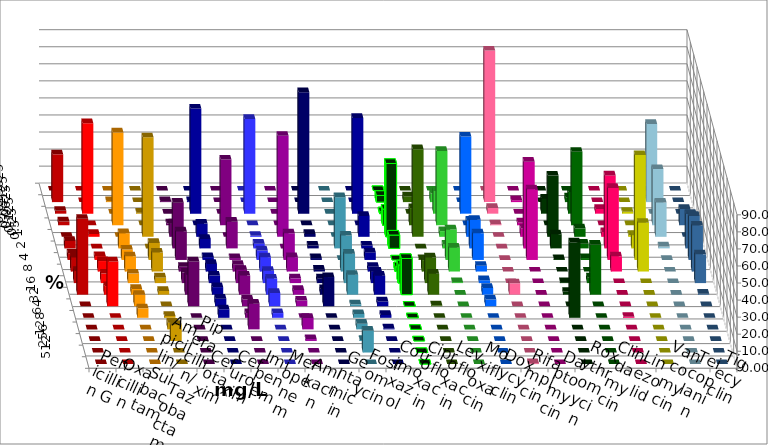
| Category | Penicillin G | Oxacillin | Ampicillin/ Sulbactam | Piperacillin/ Tazobactam | Cefotaxim | Cefuroxim | Imipenem | Meropenem | Amikacin | Gentamicin | Fosfomycin | Cotrimoxazol | Ciprofloxacin | Levofloxacin | Moxifloxacin | Doxycyclin | Rifampicin | Daptomycin | Roxythromycin | Clindamycin | Linezolid | Vancomycin | Teicoplanin | Tigecyclin |
|---|---|---|---|---|---|---|---|---|---|---|---|---|---|---|---|---|---|---|---|---|---|---|---|---|
| 0.015625 | 0 | 0 | 0 | 0 | 0 | 0 | 0 | 0 | 0 | 0 | 0 | 0 | 0 | 0 | 0 | 0 | 0 | 0 | 0 | 0 | 0 | 0 | 0 | 0 |
| 0.03125 | 28.022 | 0 | 0.556 | 0 | 0.559 | 0 | 0.556 | 0 | 0 | 0 | 0 | 0 | 3.911 | 3.352 | 5.028 | 0 | 88.889 | 1.105 | 0 | 2.762 | 0 | 0 | 0 | 45.81 |
| 0.0625 | 1.648 | 53.073 | 0 | 0.556 | 0 | 0 | 61.667 | 55.556 | 0 | 71.271 | 0 | 56.111 | 1.117 | 0 | 13.408 | 45.251 | 3.333 | 0 | 8.84 | 12.707 | 2.778 | 1.099 | 0 | 0 |
| 0.125 | 2.198 | 0 | 54.444 | 0 | 1.117 | 38.547 | 0 | 0 | 0 | 0 | 0 | 0 | 9.497 | 10.056 | 43.575 | 0 | 0.556 | 1.657 | 0 | 43.094 | 0 | 0 | 9.551 | 32.961 |
| 0.25 | 0 | 1.676 | 0 | 58.333 | 7.821 | 0 | 7.778 | 0.556 | 59.218 | 1.657 | 0 | 12.222 | 43.017 | 51.397 | 3.352 | 9.497 | 0 | 4.972 | 35.912 | 4.972 | 2.778 | 1.099 | 0 | 20.112 |
| 0.5 | 4.396 | 0 | 8.889 | 0 | 26.816 | 15.642 | 5.556 | 2.778 | 0 | 1.657 | 30 | 1.667 | 7.821 | 0 | 2.235 | 16.76 | 0 | 50.829 | 8.287 | 2.762 | 42.778 | 7.692 | 20.225 | 1.117 |
| 1.0 | 3.846 | 2.235 | 6.111 | 10 | 16.76 | 1.117 | 1.667 | 5.556 | 15.642 | 1.105 | 0 | 4.444 | 0 | 0.559 | 17.877 | 15.642 | 0 | 41.436 | 0.552 | 1.105 | 42.222 | 61.538 | 25.843 | 0 |
| 2.0 | 8.242 | 6.145 | 8.889 | 11.111 | 2.793 | 3.911 | 4.444 | 8.333 | 8.38 | 1.105 | 21.111 | 2.778 | 2.793 | 6.704 | 13.966 | 3.352 | 0 | 0 | 0 | 0 | 8.889 | 28.571 | 26.966 | 0 |
| 4.0 | 7.143 | 5.587 | 5.556 | 3.333 | 6.145 | 7.821 | 4.444 | 7.222 | 2.793 | 2.762 | 17.222 | 6.667 | 10.615 | 15.084 | 0.559 | 1.676 | 0 | 0 | 0.552 | 3.315 | 0 | 0 | 16.854 | 0 |
| 8.0 | 44.505 | 5.028 | 3.333 | 2.222 | 11.732 | 11.173 | 4.444 | 9.444 | 2.793 | 3.315 | 11.667 | 11.111 | 21.229 | 12.291 | 0 | 3.911 | 6.667 | 0 | 1.657 | 29.282 | 0 | 0 | 0.562 | 0 |
| 16.0 | 0 | 26.257 | 6.667 | 0 | 26.257 | 3.911 | 4.444 | 7.778 | 3.352 | 17.127 | 1.111 | 2.778 | 0 | 0.559 | 0 | 3.911 | 0 | 0 | 0 | 0 | 0 | 0 | 0 | 0 |
| 32.0 | 0 | 0 | 5.556 | 1.111 | 0 | 2.793 | 5 | 2.778 | 0 | 0 | 2.222 | 1.667 | 0 | 0 | 0 | 0 | 0 | 0 | 44.199 | 0 | 0.556 | 0 | 0 | 0 |
| 64.0 | 0 | 0 | 0 | 3.889 | 0 | 15.084 | 0 | 0 | 6.704 | 0 | 3.333 | 0.556 | 0 | 0 | 0 | 0 | 0 | 0 | 0 | 0 | 0 | 0 | 0 | 0 |
| 128.0 | 0 | 0 | 0 | 9.444 | 0 | 0 | 0 | 0 | 1.117 | 0 | 0.556 | 0 | 0 | 0 | 0 | 0 | 0 | 0 | 0 | 0 | 0 | 0 | 0 | 0 |
| 256.0 | 0 | 0 | 0 | 0 | 0 | 0 | 0 | 0 | 0 | 0 | 12.778 | 0 | 0 | 0 | 0 | 0 | 0 | 0 | 0 | 0 | 0 | 0 | 0 | 0 |
| 512.0 | 0 | 0 | 0 | 0 | 0 | 0 | 0 | 0 | 0 | 0 | 0 | 0 | 0 | 0 | 0 | 0 | 0.556 | 0 | 0 | 0 | 0 | 0 | 0 | 0 |